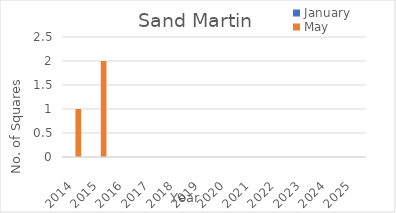
| Category | January | May |
|---|---|---|
| 2014.0 | 0 | 1 |
| 2015.0 | 0 | 2 |
| 2016.0 | 0 | 0 |
| 2017.0 | 0 | 0 |
| 2018.0 | 0 | 0 |
| 2019.0 | 0 | 0 |
| 2020.0 | 0 | 0 |
| 2021.0 | 0 | 0 |
| 2022.0 | 0 | 0 |
| 2023.0 | 0 | 0 |
| 2024.0 | 0 | 0 |
| 2025.0 | 0 | 0 |